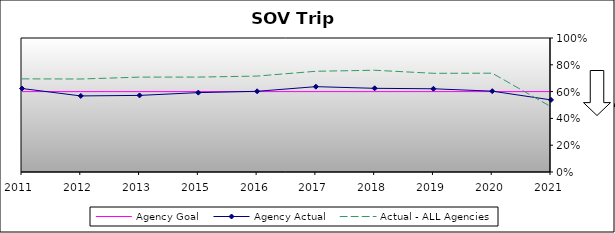
| Category | Agency Goal | Agency Actual | Actual - ALL Agencies |
|---|---|---|---|
| 2011.0 | 0.6 | 0.623 | 0.695 |
| 2012.0 | 0.6 | 0.568 | 0.694 |
| 2013.0 | 0.6 | 0.572 | 0.708 |
| 2015.0 | 0.6 | 0.592 | 0.708 |
| 2016.0 | 0.6 | 0.602 | 0.716 |
| 2017.0 | 0.6 | 0.637 | 0.752 |
| 2018.0 | 0.6 | 0.624 | 0.759 |
| 2019.0 | 0.6 | 0.621 | 0.736 |
| 2020.0 | 0.6 | 0.603 | 0.737 |
| 2021.0 | 0.6 | 0.538 | 0.487 |